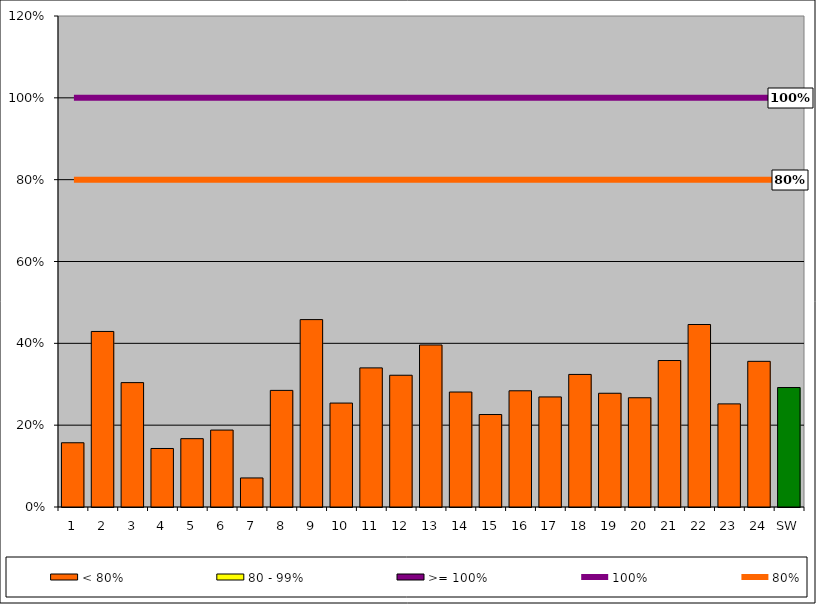
| Category | < 80% | 80 - 99% | >= 100% |
|---|---|---|---|
| 1 | 0.157 | 0 | 0 |
| 2 | 0.429 | 0 | 0 |
| 3 | 0.304 | 0 | 0 |
| 4 | 0.143 | 0 | 0 |
| 5 | 0.167 | 0 | 0 |
| 6 | 0.188 | 0 | 0 |
| 7 | 0.071 | 0 | 0 |
| 8 | 0.285 | 0 | 0 |
| 9 | 0.458 | 0 | 0 |
| 10 | 0.254 | 0 | 0 |
| 11 | 0.34 | 0 | 0 |
| 12 | 0.322 | 0 | 0 |
| 13 | 0.396 | 0 | 0 |
| 14 | 0.281 | 0 | 0 |
| 15 | 0.226 | 0 | 0 |
| 16 | 0.284 | 0 | 0 |
| 17 | 0.269 | 0 | 0 |
| 18 | 0.324 | 0 | 0 |
| 19 | 0.278 | 0 | 0 |
| 20 | 0.267 | 0 | 0 |
| 21 | 0.358 | 0 | 0 |
| 22 | 0.446 | 0 | 0 |
| 23 | 0.252 | 0 | 0 |
| 24 | 0.356 | 0 | 0 |
| SW | 0.292 | 0 | 0 |